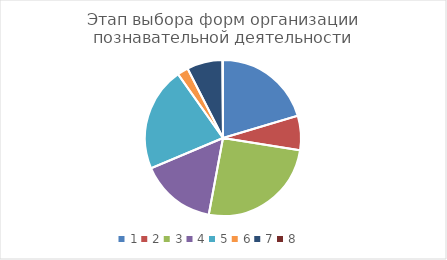
| Category | Series 0 |
|---|---|
| 0 | 0.231 |
| 1 | 0.081 |
| 2 | 0.287 |
| 3 | 0.178 |
| 4 | 0.244 |
| 5 | 0.026 |
| 6 | 0.084 |
| 7 | 0.001 |